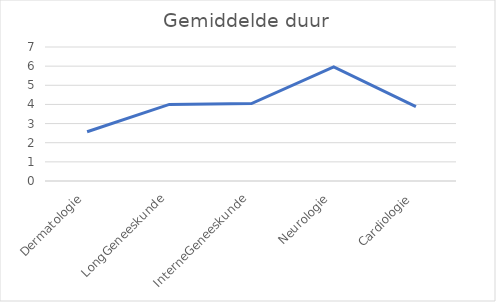
| Category | Gemiddelde duur |
|---|---|
| Dermatologie | 2.574 |
| LongGeneeskunde | 4 |
| InterneGeneeskunde | 4.043 |
| Neurologie | 5.961 |
| Cardiologie | 3.887 |